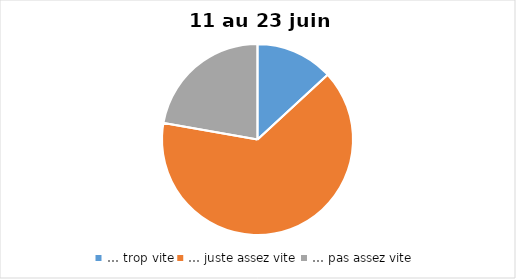
| Category | Series 0 |
|---|---|
| … trop vite | 13 |
| … juste assez vite | 64 |
| … pas assez vite | 22 |